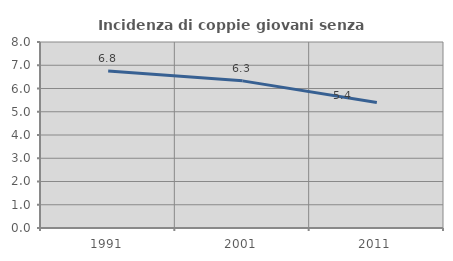
| Category | Incidenza di coppie giovani senza figli |
|---|---|
| 1991.0 | 6.753 |
| 2001.0 | 6.328 |
| 2011.0 | 5.402 |